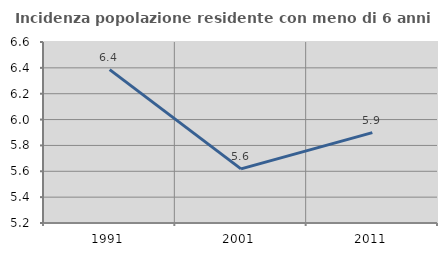
| Category | Incidenza popolazione residente con meno di 6 anni |
|---|---|
| 1991.0 | 6.387 |
| 2001.0 | 5.619 |
| 2011.0 | 5.899 |